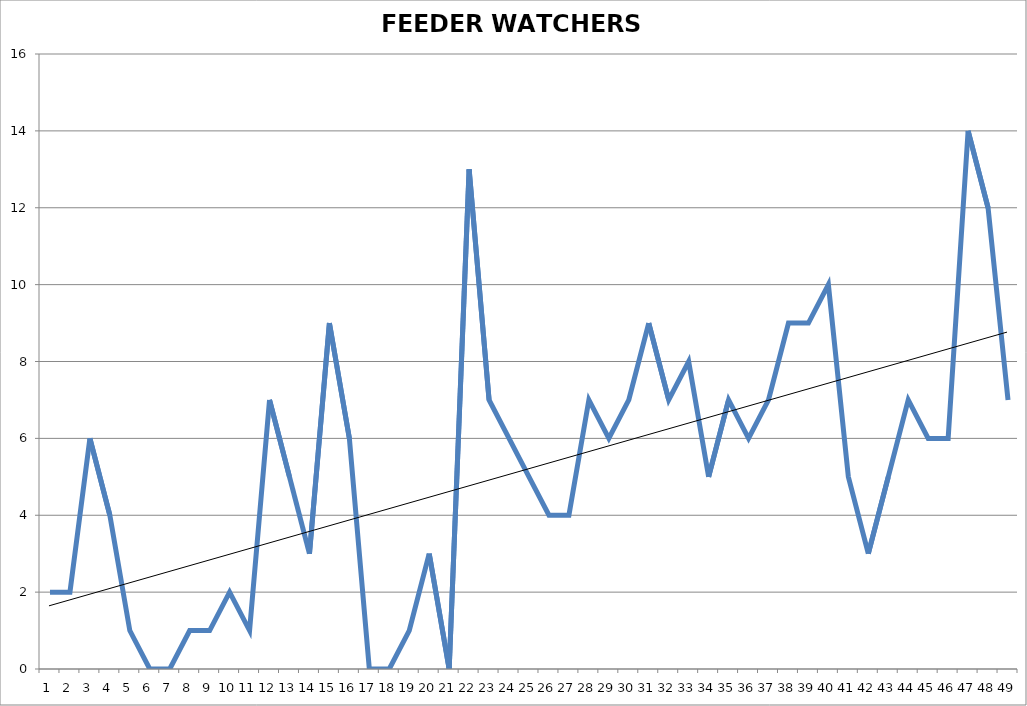
| Category | FEEDER WATCHERS 1974-2022 |
|---|---|
| 0 | 2 |
| 1 | 2 |
| 2 | 6 |
| 3 | 4 |
| 4 | 1 |
| 5 | 0 |
| 6 | 0 |
| 7 | 1 |
| 8 | 1 |
| 9 | 2 |
| 10 | 1 |
| 11 | 7 |
| 12 | 5 |
| 13 | 3 |
| 14 | 9 |
| 15 | 6 |
| 16 | 0 |
| 17 | 0 |
| 18 | 1 |
| 19 | 3 |
| 20 | 0 |
| 21 | 13 |
| 22 | 7 |
| 23 | 6 |
| 24 | 5 |
| 25 | 4 |
| 26 | 4 |
| 27 | 7 |
| 28 | 6 |
| 29 | 7 |
| 30 | 9 |
| 31 | 7 |
| 32 | 8 |
| 33 | 5 |
| 34 | 7 |
| 35 | 6 |
| 36 | 7 |
| 37 | 9 |
| 38 | 9 |
| 39 | 10 |
| 40 | 5 |
| 41 | 3 |
| 42 | 5 |
| 43 | 7 |
| 44 | 6 |
| 45 | 6 |
| 46 | 14 |
| 47 | 12 |
| 48 | 7 |